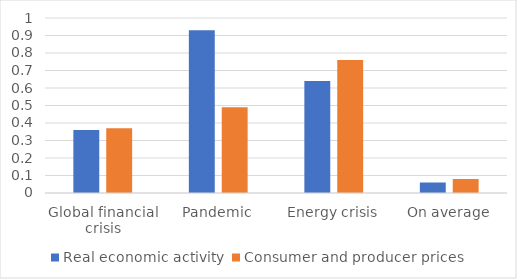
| Category | Real economic activity | Consumer and producer prices |
|---|---|---|
| Global financial crisis | 0.36 | 0.37 |
| Pandemic | 0.93 | 0.49 |
| Energy crisis | 0.64 | 0.76 |
| On average | 0.06 | 0.08 |